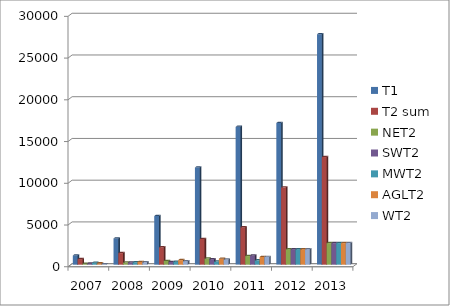
| Category | T1 | T2 sum | NET2 | SWT2 | MWT2 | AGLT2 | WT2 |
|---|---|---|---|---|---|---|---|
| 2007.0 | 1100 | 665 | 103 | 143 | 213 | 155 | 51 |
| 2008.0 | 3136 | 1379 | 244 | 256 | 282 | 322 | 275 |
| 2009.0 | 5822 | 2085.5 | 445 | 328 | 358 | 542 | 412.5 |
| 2010.0 | 11637 | 3066.75 | 727 | 650 | 362 | 709 | 618.75 |
| 2011.0 | 16509 | 4481.125 | 1024 | 1103 | 512 | 914 | 928.125 |
| 2012.0 | 16964.8 | 9255 | 1851 | 1851 | 1851 | 1851 | 1851 |
| 2013.0 | 27600 | 12888 | 2577.6 | 2577.6 | 2577.6 | 2577.6 | 2577.6 |